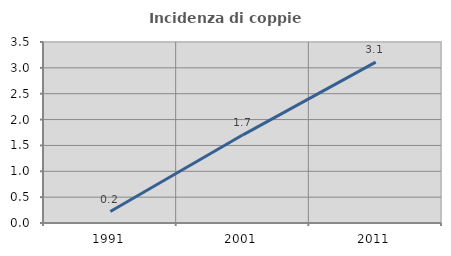
| Category | Incidenza di coppie miste |
|---|---|
| 1991.0 | 0.222 |
| 2001.0 | 1.705 |
| 2011.0 | 3.11 |